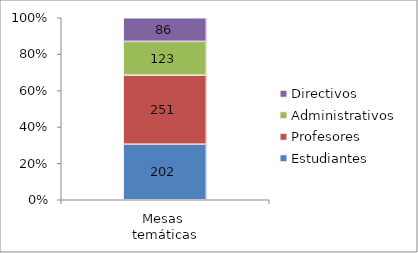
| Category | Estudiantes | Profesores | Administrativos  | Directivos |
|---|---|---|---|---|
| Mesas 
temáticas | 202 | 251 | 123 | 86 |